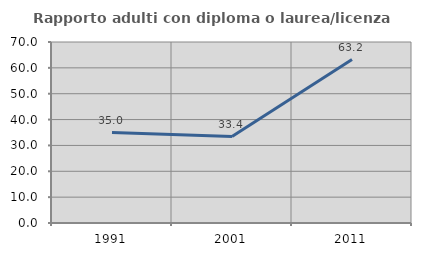
| Category | Rapporto adulti con diploma o laurea/licenza media  |
|---|---|
| 1991.0 | 35 |
| 2001.0 | 33.448 |
| 2011.0 | 63.211 |